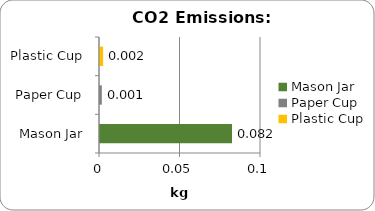
| Category | Series 0 |
|---|---|
| Mason Jar | 0.082 |
| Paper Cup | 0.001 |
| Plastic Cup | 0.002 |